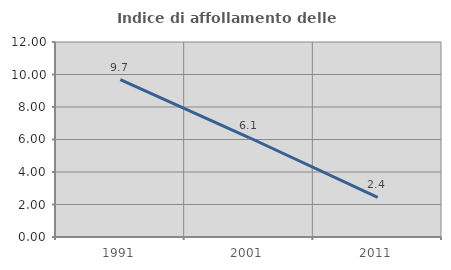
| Category | Indice di affollamento delle abitazioni  |
|---|---|
| 1991.0 | 9.677 |
| 2001.0 | 6.122 |
| 2011.0 | 2.439 |